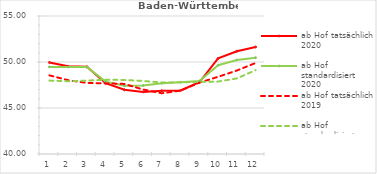
| Category | ab Hof tatsächlich 2020 | ab Hof standardisiert 2020 | ab Hof tatsächlich 2019 | ab Hof standardisiert 2019 |
|---|---|---|---|---|
| 0 | 49.949 | 49.468 | 48.549 | 47.979 |
| 1 | 49.536 | 49.454 | 48.02 | 47.911 |
| 2 | 49.482 | 49.447 | 47.729 | 47.979 |
| 3 | 47.697 | 47.868 | 47.679 | 48.073 |
| 4 | 46.981 | 47.413 | 47.618 | 48.049 |
| 5 | 46.75 | 47.444 | 47.006 | 47.94 |
| 6 | 46.873 | 47.695 | 46.602 | 47.771 |
| 7 | 46.909 | 47.8 | 46.893 | 47.796 |
| 8 | 47.797 | 47.923 | 47.752 | 47.84 |
| 9 | 50.389 | 49.656 | 48.394 | 47.869 |
| 10 | 51.175 | 50.222 | 49.075 | 48.218 |
| 11 | 51.634 | 50.471 | 49.893 | 49.114 |